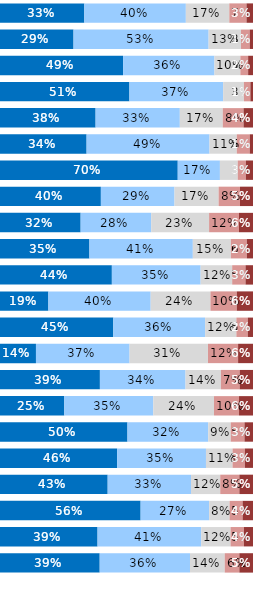
| Category | Almost Always or Always | Usually | Occasionally | Seldom | Never or Almost Never |
|---|---|---|---|---|---|
| Q1 | 0.333 | 0.401 | 0.172 | 0.068 | 0.026 |
| Q2 | 0.291 | 0.534 | 0.128 | 0.035 | 0.013 |
| Q3 | 0.487 | 0.361 | 0.102 | 0.031 | 0.019 |
| Q4 | 0.512 | 0.371 | 0.082 | 0.026 | 0.01 |
| Q5 | 0.378 | 0.333 | 0.17 | 0.082 | 0.037 |
| Q6 | 0.342 | 0.486 | 0.108 | 0.051 | 0.013 |
| Q7 | 0.703 | 0.167 | 0.071 | 0.032 | 0.028 |
| Q8 | 0.399 | 0.291 | 0.174 | 0.085 | 0.051 |
| Q9 | 0.319 | 0.279 | 0.229 | 0.118 | 0.055 |
| Q10 | 0.353 | 0.409 | 0.15 | 0.063 | 0.024 |
| Q11 | 0.442 | 0.351 | 0.125 | 0.053 | 0.03 |
| Q12 | 0.191 | 0.404 | 0.236 | 0.104 | 0.064 |
| Q13 | 0.448 | 0.363 | 0.124 | 0.045 | 0.021 |
| Q14 | 0.142 | 0.37 | 0.31 | 0.119 | 0.059 |
| Q15 | 0.395 | 0.338 | 0.14 | 0.074 | 0.053 |
| Q16 | 0.254 | 0.352 | 0.24 | 0.099 | 0.055 |
| Q17 | 0.504 | 0.319 | 0.089 | 0.054 | 0.034 |
| Q18 | 0.463 | 0.351 | 0.105 | 0.049 | 0.032 |
| Q19 | 0.426 | 0.329 | 0.115 | 0.076 | 0.054 |
| Q20 | 0.556 | 0.271 | 0.081 | 0.051 | 0.041 |
| Q21 | 0.386 | 0.41 | 0.116 | 0.053 | 0.036 |
| Q22 | 0.394 | 0.357 | 0.137 | 0.058 | 0.054 |